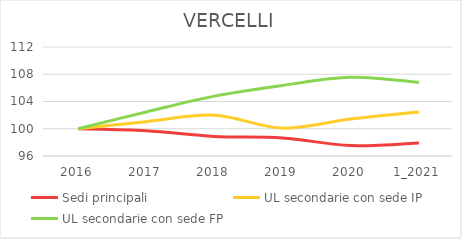
| Category | Sedi principali | UL secondarie con sede IP | UL secondarie con sede FP |
|---|---|---|---|
| 2016 | 100 | 100 | 100 |
| 2017 | 99.695 | 101.045 | 102.468 |
| 2018 | 98.867 | 101.994 | 104.787 |
| 2019 | 98.648 | 100.095 | 106.358 |
| 2020 | 97.527 | 101.425 | 107.554 |
| 1_2021 | 97.917 | 102.469 | 106.806 |